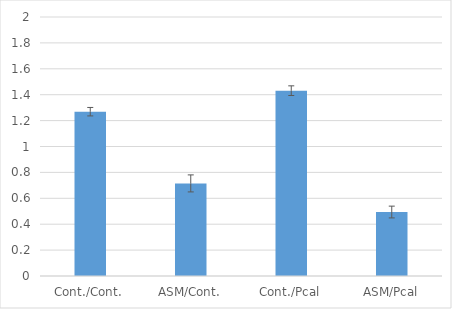
| Category | Series 0 |
|---|---|
| Cont./Cont. | 1.269 |
| ASM/Cont. | 0.715 |
| Cont./Pcal | 1.431 |
| ASM/Pcal | 0.494 |